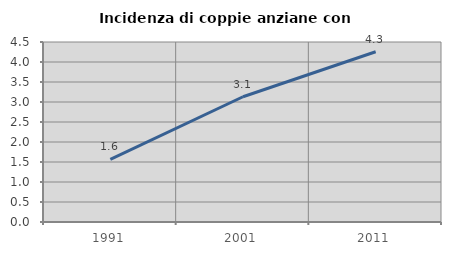
| Category | Incidenza di coppie anziane con figli |
|---|---|
| 1991.0 | 1.568 |
| 2001.0 | 3.132 |
| 2011.0 | 4.256 |